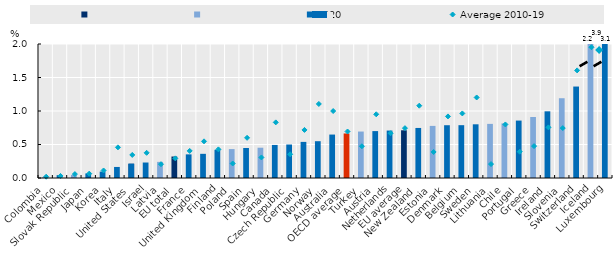
| Category | Series 1 | Series 0 | 2020 |
|---|---|---|---|
| Colombia | 0 | 0.015 | 0 |
| Mexico | 0 | 0 | 0.043 |
| Slovak Republic | 0 | 0.046 | 0 |
| Japan | 0 | 0 | 0.068 |
| Korea | 0 | 0 | 0.096 |
| Italy | 0 | 0 | 0.165 |
| United States | 0.213 | 0 | 0.213 |
| Israel | 0 | 0 | 0.231 |
| Latvia | 0 | 0.241 | 0 |
| EU total | 0.321 | 0 | 0 |
| France | 0 | 0 | 0.353 |
| United Kingdom | 0 | 0 | 0.361 |
| Finland | 0 | 0 | 0.42 |
| Poland | 0 | 0.432 | 0 |
| Spain | 0 | 0 | 0.448 |
| Hungary | 0 | 0.452 | 0 |
| Canada | 0 | 0 | 0.493 |
| Czech Republic | 0 | 0 | 0.5 |
| Germany | 0 | 0 | 0.539 |
| Norway | 0 | 0 | 0.549 |
| Australia | 0 | 0 | 0.648 |
| OECD average | 0.665 | 0 | 0 |
| Turkey | 0 | 0.693 | 0 |
| Austria | 0 | 0 | 0.7 |
| Netherlands | 0 | 0 | 0.708 |
| EU average | 0.712 | 0 | 0 |
| New Zealand | 0 | 0 | 0.747 |
| Estonia | 0 | 0.778 | 0 |
| Denmark | 0 | 0 | 0.788 |
| Belgium | 0 | 0 | 0.788 |
| Sweden | 0 | 0 | 0.801 |
| Lithuania | 0 | 0.808 | 0 |
| Chile | 0 | 0.815 | 0 |
| Portugal | 0 | 0 | 0.857 |
| Greece | 0 | 0.911 | 0 |
| Ireland | 0 | 0 | 0.995 |
| Slovenia | 0 | 1.191 | 0 |
| Switzerland | 0 | 0 | 1.365 |
| Iceland | 0 | 2.23 | 0 |
| Luxembourg | 0 | 0 | 3.105 |